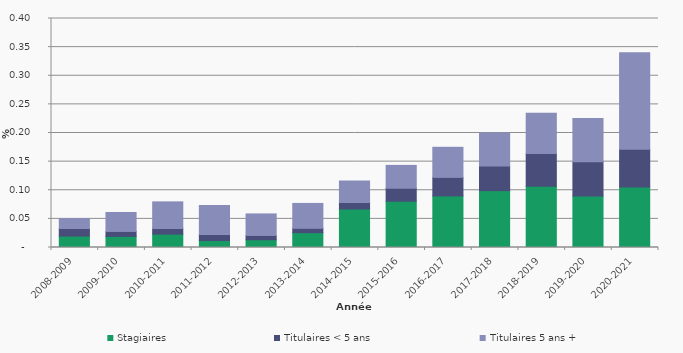
| Category | Stagiaires | Titulaires < 5 ans | Titulaires 5 ans + |
|---|---|---|---|
| 2008-2009 | 0.02 | 0.013 | 0.017 |
| 2009-2010 | 0.019 | 0.009 | 0.033 |
| 2010-2011 | 0.023 | 0.01 | 0.047 |
| 2011-2012 | 0.012 | 0.011 | 0.051 |
| 2012-2013 | 0.014 | 0.007 | 0.038 |
| 2013-2014 | 0.026 | 0.008 | 0.043 |
| 2014-2015 | 0.067 | 0.011 | 0.038 |
| 2015-2016 | 0.081 | 0.023 | 0.04 |
| 2016-2017 | 0.09 | 0.032 | 0.053 |
| 2017-2018 | 0.099 | 0.043 | 0.058 |
| 2018-2019 | 0.107 | 0.057 | 0.07 |
| 2019-2020 | 0.09 | 0.06 | 0.076 |
| 2020-2021 | 0.106 | 0.066 | 0.169 |